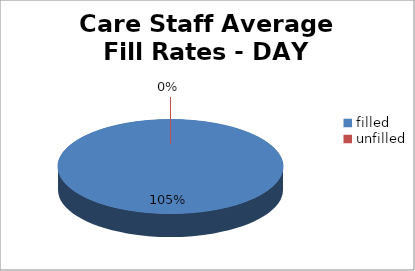
| Category | Series 0 |
|---|---|
| filled | 105 |
| unfilled | 0 |